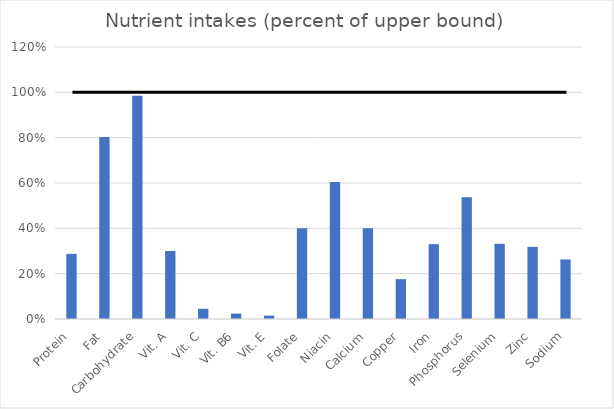
| Category | Series 0 |
|---|---|
| 0 | 0.287 |
| 1 | 0.803 |
| 2 | 0.985 |
| 3 | 0.3 |
| 4 | 0.045 |
| 5 | 0.024 |
| 6 | 0.015 |
| 7 | 0.4 |
| 8 | 0.604 |
| 9 | 0.4 |
| 10 | 0.176 |
| 11 | 0.33 |
| 12 | 0.537 |
| 13 | 0.332 |
| 14 | 0.318 |
| 15 | 0.263 |